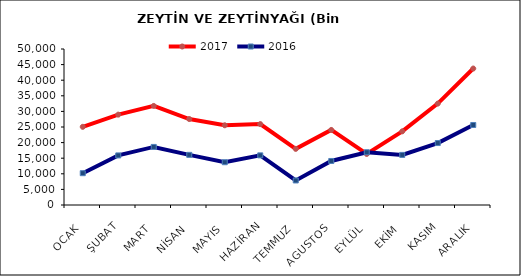
| Category | 2017 | 2016 |
|---|---|---|
| OCAK | 25053.806 | 10191.508 |
| ŞUBAT | 28959.574 | 15895.203 |
| MART | 31758.513 | 18612.352 |
| NİSAN | 27550.556 | 16074.062 |
| MAYIS | 25553.173 | 13709.486 |
| HAZİRAN | 25930.345 | 15906.684 |
| TEMMUZ | 17993.176 | 7864.169 |
| AGUSTOS | 24056.735 | 14110.556 |
| EYLÜL | 16366.568 | 16903.757 |
| EKİM | 23613.367 | 16057.673 |
| KASIM | 32499.29 | 19860.463 |
| ARALIK | 43740.694 | 25643.104 |